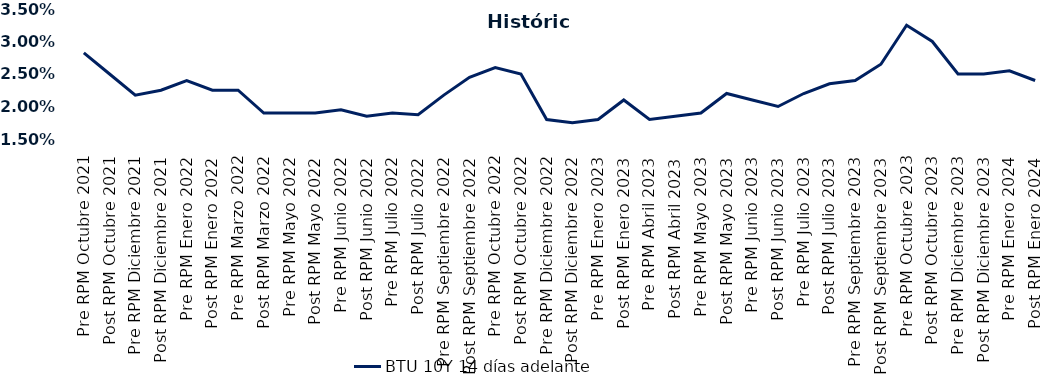
| Category | BTU 10Y 14 días adelante |
|---|---|
| Pre RPM Octubre 2021 | 0.028 |
| Post RPM Octubre 2021 | 0.025 |
| Pre RPM Diciembre 2021 | 0.022 |
| Post RPM Diciembre 2021 | 0.022 |
| Pre RPM Enero 2022 | 0.024 |
| Post RPM Enero 2022 | 0.022 |
| Pre RPM Marzo 2022 | 0.022 |
| Post RPM Marzo 2022 | 0.019 |
| Pre RPM Mayo 2022 | 0.019 |
| Post RPM Mayo 2022 | 0.019 |
| Pre RPM Junio 2022 | 0.02 |
| Post RPM Junio 2022 | 0.018 |
| Pre RPM Julio 2022 | 0.019 |
| Post RPM Julio 2022 | 0.019 |
| Pre RPM Septiembre 2022 | 0.022 |
| Post RPM Septiembre 2022 | 0.024 |
| Pre RPM Octubre 2022 | 0.026 |
| Post RPM Octubre 2022 | 0.025 |
| Pre RPM Diciembre 2022 | 0.018 |
| Post RPM Diciembre 2022 | 0.018 |
| Pre RPM Enero 2023 | 0.018 |
| Post RPM Enero 2023 | 0.021 |
| Pre RPM Abril 2023 | 0.018 |
| Post RPM Abril 2023 | 0.018 |
| Pre RPM Mayo 2023 | 0.019 |
| Post RPM Mayo 2023 | 0.022 |
| Pre RPM Junio 2023 | 0.021 |
| Post RPM Junio 2023 | 0.02 |
| Pre RPM Julio 2023 | 0.022 |
| Post RPM Julio 2023 | 0.024 |
| Pre RPM Septiembre 2023 | 0.024 |
| Post RPM Septiembre 2023 | 0.026 |
| Pre RPM Octubre 2023 | 0.032 |
| Post RPM Octubre 2023 | 0.03 |
| Pre RPM Diciembre 2023 | 0.025 |
| Post RPM Diciembre 2023 | 0.025 |
| Pre RPM Enero 2024 | 0.026 |
| Post RPM Enero 2024 | 0.024 |